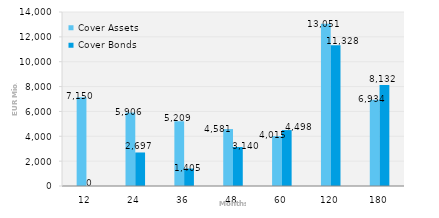
| Category | Cover Assets | Cover Bonds |
|---|---|---|
| 12.0 | 7149.602 | 0 |
| 24.0 | 5905.542 | 2697.049 |
| 36.0 | 5208.942 | 1405.3 |
| 48.0 | 4580.541 | 3140.1 |
| 60.0 | 4014.925 | 4497.622 |
| 120.0 | 13051.152 | 11327.746 |
| 180.0 | 6934.127 | 8131.869 |